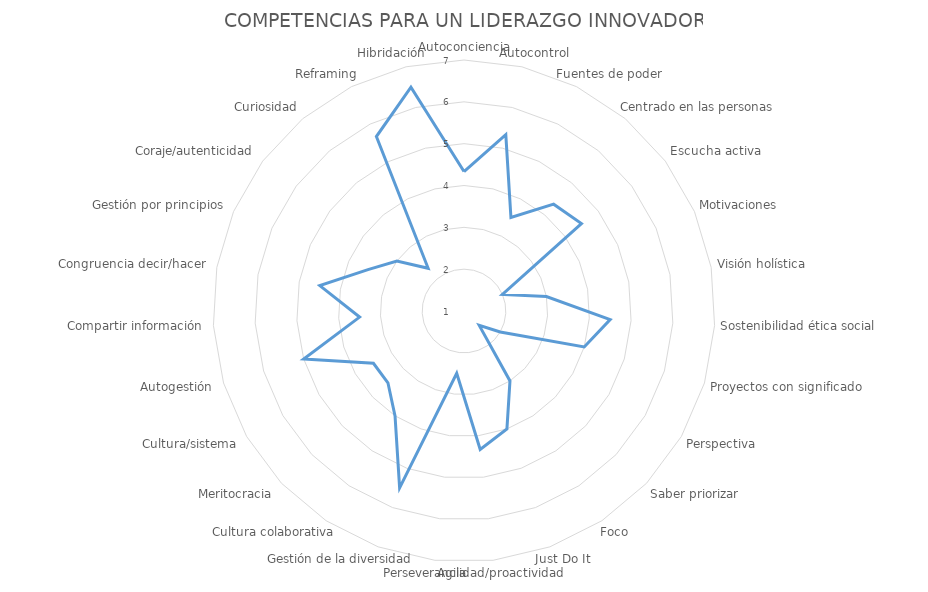
| Category | COMPETENCIAS PARA UN LIDERAZGO INNOVADOR |
|---|---|
| Autoconciencia

 | 4.333 |
| Autocontrol 
 | 5.333 |
| Fuentes de poder | 3.5 |
| Centrado en las personas | 4.333 |
| Escucha activa | 4.5 |
| Motivaciones | 2 |
| Visión holística | 3 |
| Sostenibilidad ética social | 4.5 |
| Proyectos con significado | 4 |
| Perspectiva | 2 |
| Saber priorizar | 1.5 |
| Foco | 3 |
| Just Do It | 4 |
| Agilidad/proactividad | 4.333 |
| Perseverancia | 2.5 |
| Gestión de la diversidad | 5.5 |
| Cultura colaborativa | 4 |
| Meritocracia | 3.5 |
| Cultura/sistema | 3.5 |
| Autogestión | 5 |
| Compartir información | 3.5 |
| Congruencia decir/hacer | 4.5 |
| Gestión por principios | 3.5 |
| Coraje/autenticidad | 3 |
| Curiosidad | 2.333 |
| Reframing | 5.667 |
| Hibridación | 6.5 |